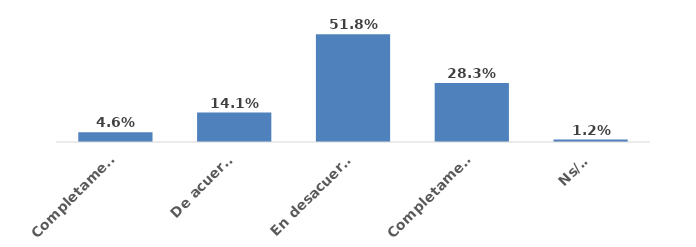
| Category | Series 0 |
|---|---|
| Completamente de acuerdo | 0.046 |
| De acuerdo | 0.141 |
| En desacuerdo | 0.518 |
| Completamente en desacuerdo | 0.283 |
| Ns/Nr | 0.012 |